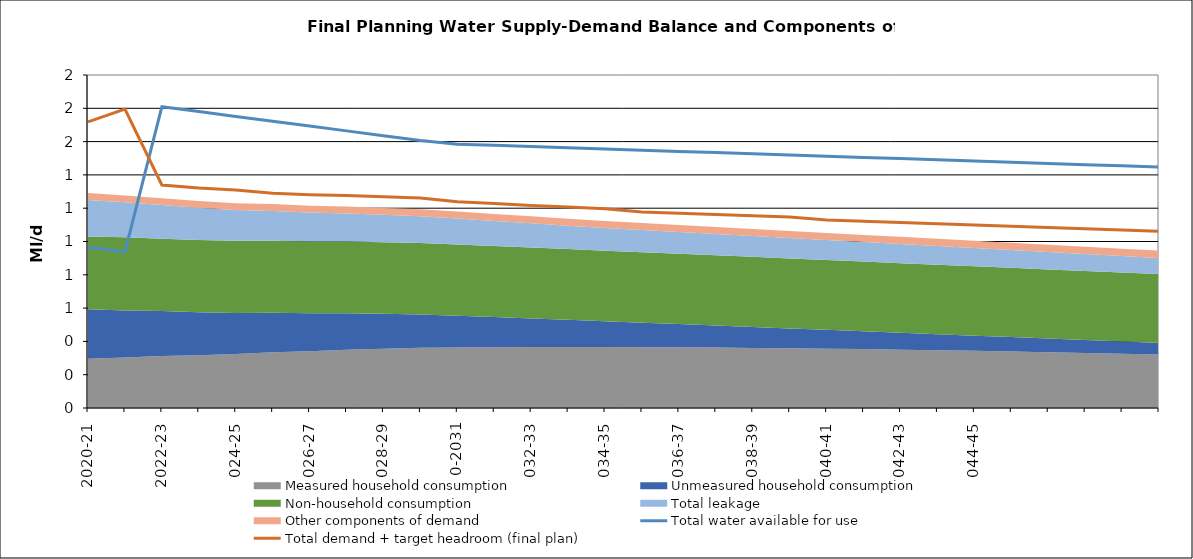
| Category | Total water available for use | Total demand + target headroom (final plan) |
|---|---|---|
| 2020-21 | 0.967 | 1.719 |
| 2021-22 | 0.938 | 1.795 |
| 2022-23 | 1.809 | 1.339 |
| 2023-24 | 1.78 | 1.322 |
| 2024-25 | 1.751 | 1.31 |
| 2025-26 | 1.722 | 1.289 |
| 2026-27 | 1.693 | 1.281 |
| 2027-28 | 1.664 | 1.277 |
| 2028-29 | 1.635 | 1.269 |
| 2029-30 | 1.606 | 1.262 |
| 2030-31 | 1.585 | 1.239 |
| 2031-32 | 1.577 | 1.228 |
| 2032-33 | 1.57 | 1.217 |
| 2033-34 | 1.563 | 1.207 |
| 2034-35 | 1.556 | 1.196 |
| 2035-36 | 1.548 | 1.178 |
| 2036-37 | 1.541 | 1.17 |
| 2037-38 | 1.534 | 1.162 |
| 2038-39 | 1.527 | 1.155 |
| 2039-40 | 1.519 | 1.147 |
| 2040-41 | 1.512 | 1.129 |
| 2041-42 | 1.505 | 1.121 |
| 2042-43 | 1.498 | 1.114 |
| 2043-44 | 1.491 | 1.107 |
| 2044-45 | 1.483 | 1.099 |
| 2045-46 | 1.476 | 1.092 |
| 2046-47 | 1.469 | 1.085 |
| 2047-48 | 1.462 | 1.076 |
| 2048-49 | 1.454 | 1.069 |
| 2049-50 | 1.447 | 1.061 |